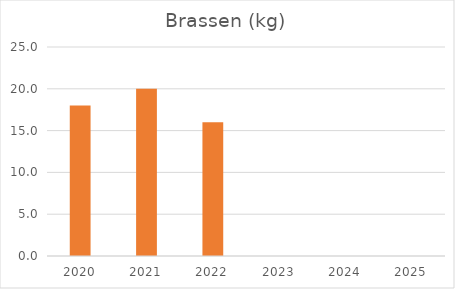
| Category | Brassen (kg) |
|---|---|
| 2020.0 | 18 |
| 2021.0 | 20 |
| 2022.0 | 16 |
| 2023.0 | 0 |
| 2024.0 | 0 |
| 2025.0 | 0 |